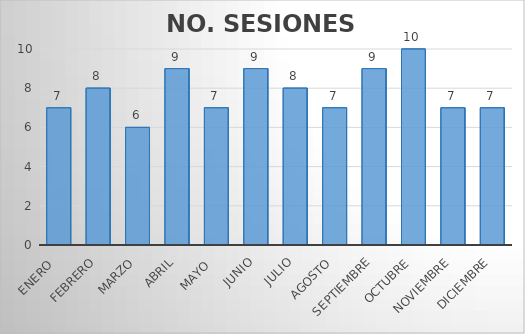
| Category | NO. SESIONES EFECTUADAS |
|---|---|
| Enero  | 7 |
| Febrero | 8 |
| Marzo | 6 |
| Abril | 9 |
| Mayo  | 7 |
| Junio | 9 |
| Julio | 8 |
| Agosto | 7 |
| Septiembre | 9 |
| Octubre | 10 |
| Noviembre | 7 |
| Diciembre | 7 |